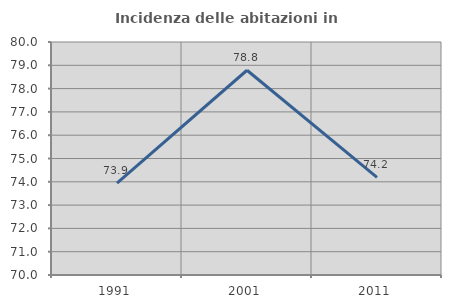
| Category | Incidenza delle abitazioni in proprietà  |
|---|---|
| 1991.0 | 73.947 |
| 2001.0 | 78.788 |
| 2011.0 | 74.194 |